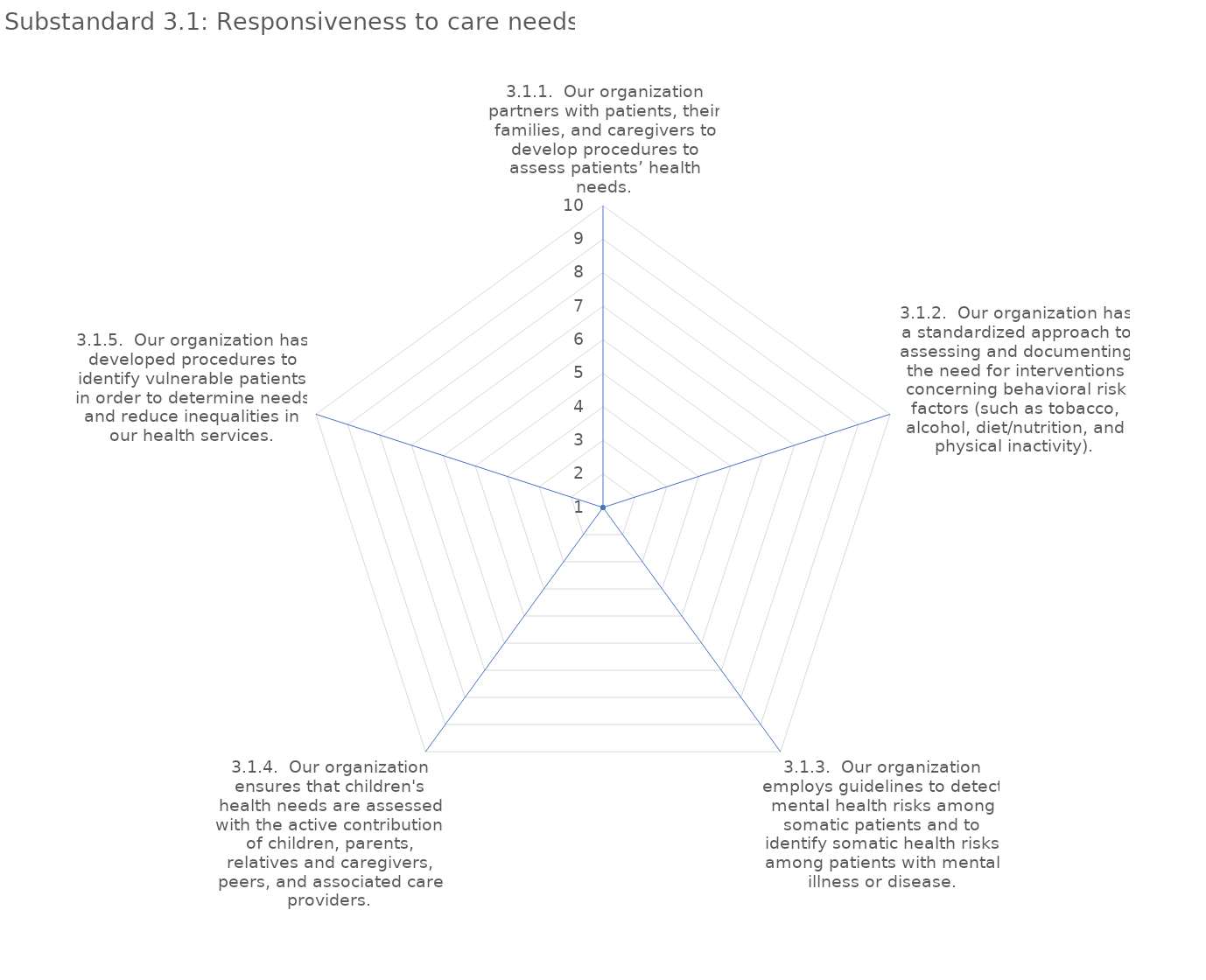
| Category | value |
|---|---|
| 3.1.1.  Our organization partners with patients, their families, and caregivers to develop procedures to assess patients’ health needs. | 1 |
| 3.1.2.  Our organization has a standardized approach to assessing and documenting the need for interventions concerning behavioral risk factors (such as tobacco, alcohol, diet/nutrition, and physical inactivity). | 1 |
| 3.1.3.  Our organization employs guidelines to detect mental health risks among somatic patients and to identify somatic health risks among patients with mental illness or disease. | 1 |
| 3.1.4.  Our organization ensures that children's health needs are assessed with the active contribution of children, parents, relatives and caregivers, peers, and associated care providers. | 1 |
| 3.1.5.  Our organization has developed procedures to identify vulnerable patients in order to determine needs and reduce inequalities in our health services. | 1 |